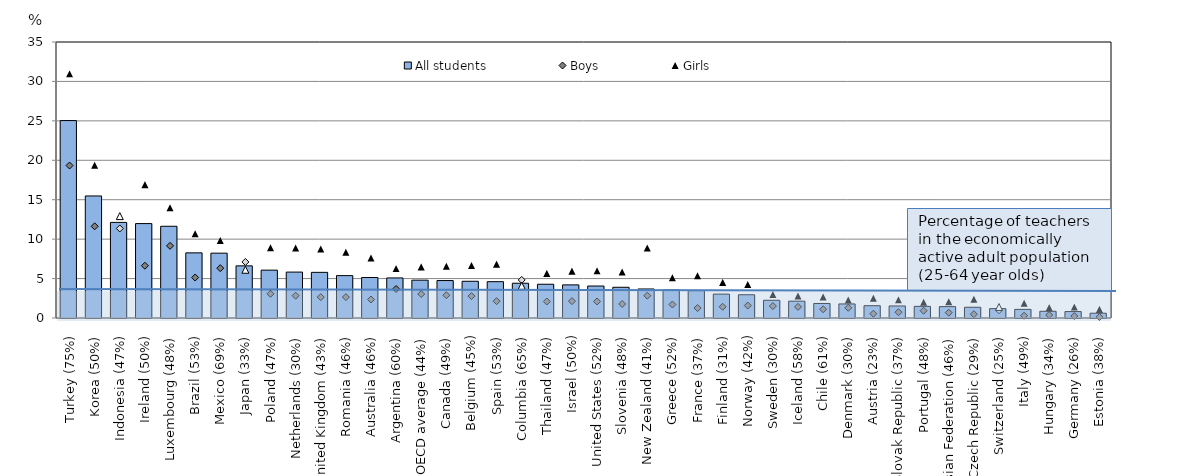
| Category | All students |
|---|---|
| Turkey (75%) | 25.038 |
| Korea (50%) | 15.476 |
| Indonesia (47%) | 12.123 |
| Ireland (50%) | 11.974 |
| Luxembourg (48%) | 11.632 |
| Brazil (53%) | 8.26 |
| Mexico (69%) | 8.222 |
| Japan (33%) | 6.611 |
| Poland (47%) | 6.068 |
| Netherlands (30%) | 5.822 |
| United Kingdom (43%) | 5.789 |
| Romania (46%) | 5.374 |
| Australia (46%) | 5.135 |
| Argentina (60%) | 5.079 |
| OECD average (44%) | 4.797 |
| Canada (49%) | 4.75 |
| Belgium (45%) | 4.658 |
| Spain (53%) | 4.608 |
| Columbia (65%) | 4.41 |
| Thailand (47%) | 4.28 |
| Israel (50%) | 4.2 |
| United States (52%) | 4.054 |
| Slovenia (48%) | 3.896 |
| New Zealand (41%) | 3.68 |
| Greece (52%) | 3.551 |
| France (37%) | 3.471 |
| Finland (31%) | 3.03 |
| Norway (42%) | 2.947 |
| Sweden (30%) | 2.248 |
| Iceland (58%) | 2.136 |
| Chile (61%) | 1.843 |
| Denmark (30%) | 1.783 |
| Austria (23%) | 1.557 |
| Slovak Republic (37%) | 1.526 |
| Portugal (48%) | 1.476 |
| Russian Federation (46%) | 1.443 |
| Czech Republic (29%) | 1.363 |
| Switzerland (25%) | 1.188 |
| Italy (49%) | 1.093 |
| Hungary (34%) | 0.854 |
| Germany (26%) | 0.816 |
| Estonia (38%) | 0.608 |